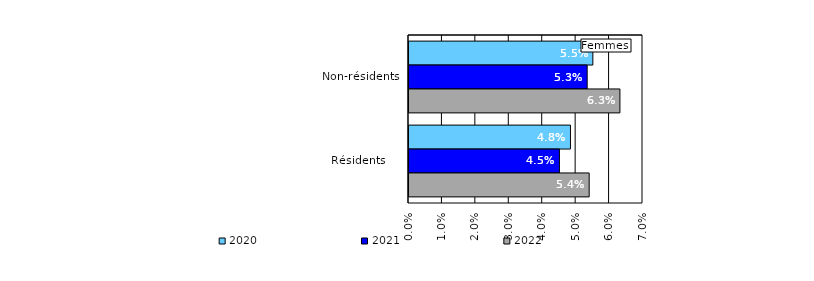
| Category | 2020 | 2021 | 2022 |
|---|---|---|---|
| Non-résidents | 0.055 | 0.053 | 0.063 |
|  Résidents     | 0.048 | 0.045 | 0.054 |